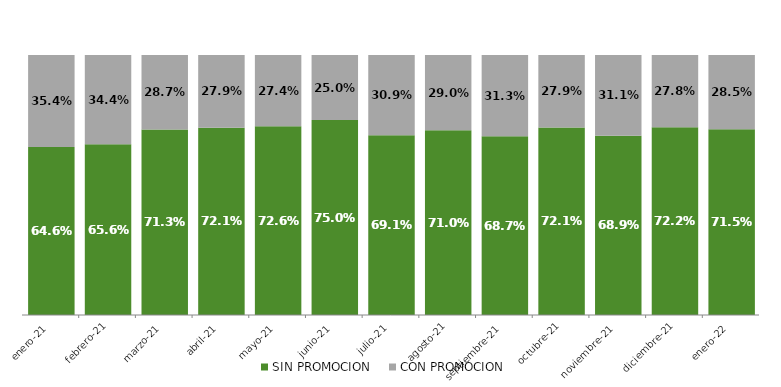
| Category | SIN PROMOCION   | CON PROMOCION   |
|---|---|---|
| 2021-01-01 | 0.646 | 0.354 |
| 2021-02-01 | 0.656 | 0.344 |
| 2021-03-01 | 0.713 | 0.287 |
| 2021-04-01 | 0.721 | 0.279 |
| 2021-05-01 | 0.726 | 0.274 |
| 2021-06-01 | 0.75 | 0.25 |
| 2021-07-01 | 0.691 | 0.309 |
| 2021-08-01 | 0.71 | 0.29 |
| 2021-09-01 | 0.687 | 0.313 |
| 2021-10-01 | 0.721 | 0.279 |
| 2021-11-01 | 0.689 | 0.311 |
| 2021-12-01 | 0.722 | 0.278 |
| 2022-01-01 | 0.715 | 0.285 |